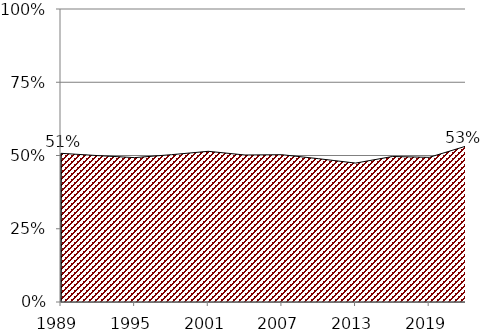
| Category | Series 0 |
|---|---|
| 1989.0 | 0.507 |
| 1992.0 | 0.5 |
| 1995.0 | 0.493 |
| 1998.0 | 0.503 |
| 2001.0 | 0.514 |
| 2004.0 | 0.502 |
| 2007.0 | 0.503 |
| 2010.0 | 0.489 |
| 2013.0 | 0.474 |
| 2016.0 | 0.497 |
| 2019.0 | 0.494 |
| 2022.0 | 0.532 |